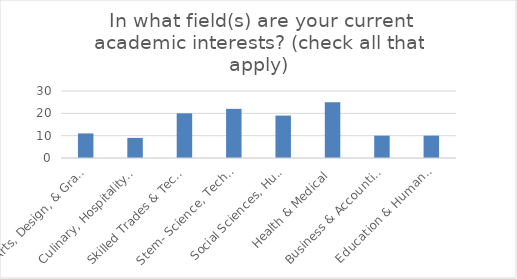
| Category | Series 0 |
|---|---|
| Arts, Design, & Graphics | 11 |
| Culinary, Hospitality, & Wine | 9 |
| Skilled Trades & Technician Training | 20 |
| Stem- Science, Technology, Engineering, & Math | 22 |
| Social Sciences, Humanities, & Languages | 19 |
| Health & Medical | 25 |
| Business & Accounting | 10 |
| Education & Human Services | 10 |